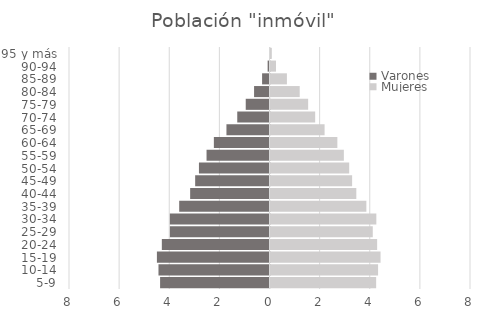
| Category | Varones | Mujeres |
|---|---|---|
| 5-9 | -4.365 | 4.216 |
| 10-14 | -4.43 | 4.292 |
| 15-19 | -4.493 | 4.391 |
| 20-24 | -4.296 | 4.255 |
| 25-29 | -3.975 | 4.081 |
| 30-34 | -3.976 | 4.223 |
| 35-39 | -3.603 | 3.825 |
| 40-44 | -3.166 | 3.424 |
| 45-49 | -2.966 | 3.256 |
| 50-54 | -2.815 | 3.14 |
| 55-59 | -2.512 | 2.927 |
| 60-64 | -2.22 | 2.668 |
| 65-69 | -1.718 | 2.158 |
| 70-74 | -1.287 | 1.782 |
| 75-79 | -0.948 | 1.502 |
| 80-84 | -0.616 | 1.166 |
| 85-89 | -0.296 | 0.655 |
| 90-94 | -0.075 | 0.219 |
| 95 y más | -0.013 | 0.053 |